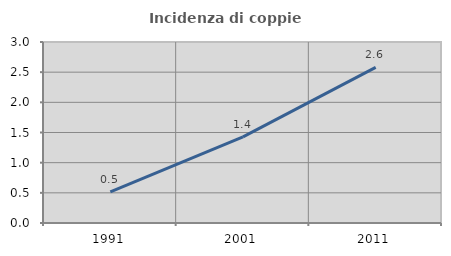
| Category | Incidenza di coppie miste |
|---|---|
| 1991.0 | 0.516 |
| 2001.0 | 1.426 |
| 2011.0 | 2.58 |